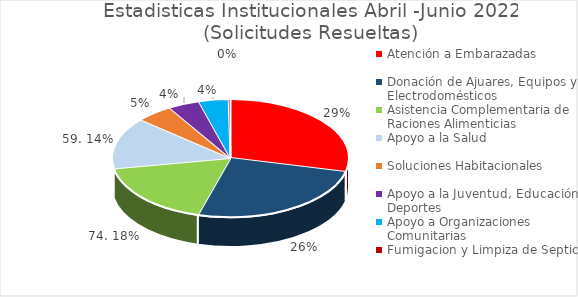
| Category | Series 0 |
|---|---|
| Atención a Embarazadas | 120 |
| Donación de Ajuares, Equipos y Electrodomésticos | 107 |
| Asistencia Complementaria de Raciones Alimenticias | 74 |
| Apoyo a la Salud | 59 |
| Soluciones Habitacionales | 21 |
| Apoyo a la Juventud, Educación y Deportes | 18 |
| Apoyo a Organizaciones Comunitarias | 17 |
| Fumigacion y Limpiza de Septico | 1 |